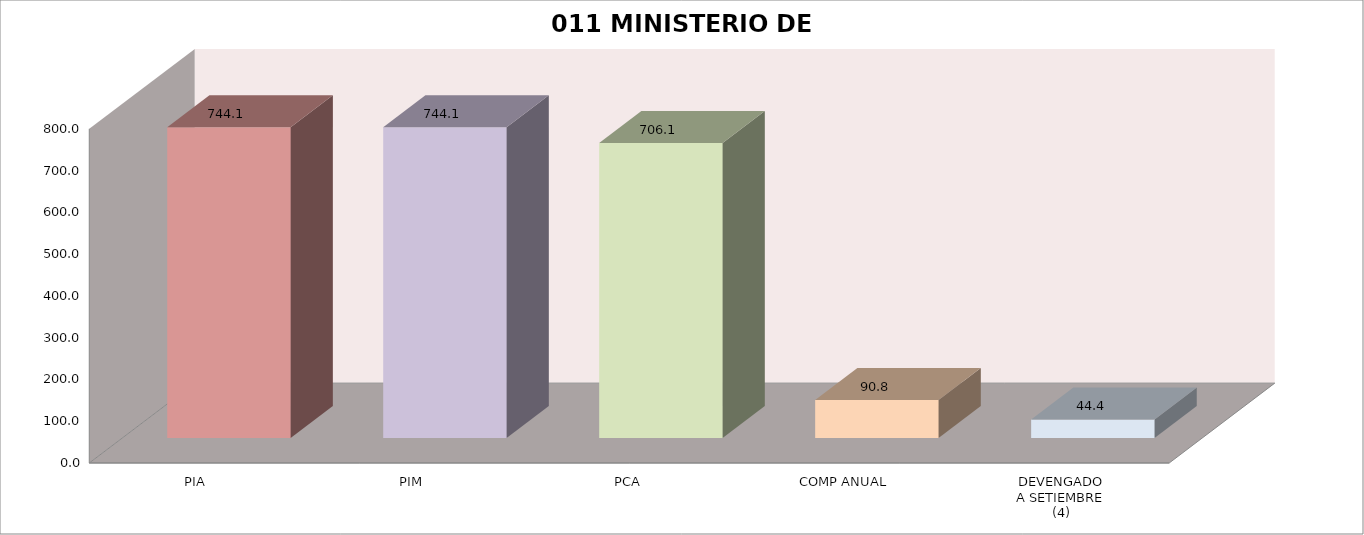
| Category | 011 MINISTERIO DE SALUD |
|---|---|
| PIA | 744.088 |
| PIM | 744.088 |
| PCA | 706.088 |
| COMP ANUAL | 90.771 |
| DEVENGADO
A SETIEMBRE
(4) | 44.376 |